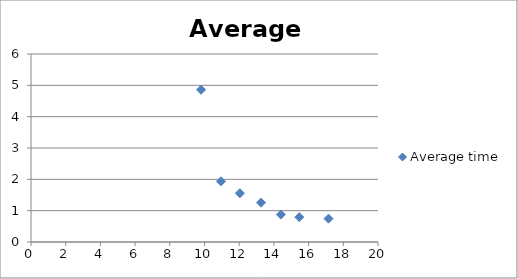
| Category | Average time |
|---|---|
| 9.8 | 4.859 |
| 10.95 | 1.938 |
| 12.04 | 1.557 |
| 13.26 | 1.256 |
| 14.4 | 0.875 |
| 15.463 | 0.794 |
| 17.15 | 0.745 |